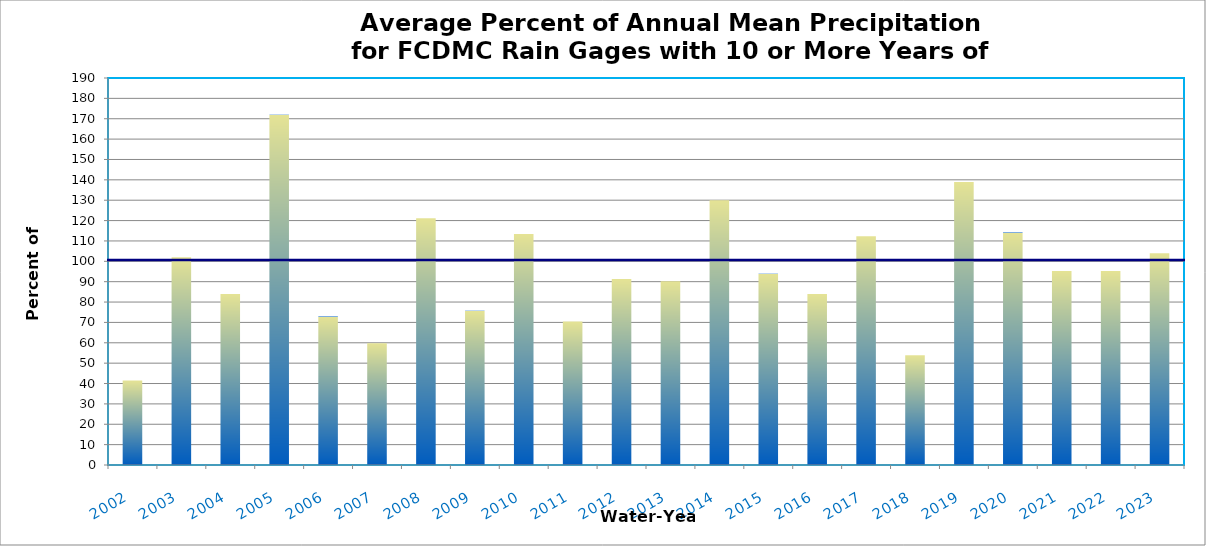
| Category | Series 0 |
|---|---|
| 2002.0 | 41.5 |
| 2003.0 | 102 |
| 2004.0 | 84 |
| 2005.0 | 172 |
| 2006.0 | 72.9 |
| 2007.0 | 59.8 |
| 2008.0 | 121.1 |
| 2009.0 | 75.7 |
| 2010.0 | 113.4 |
| 2011.0 | 70.5 |
| 2012.0 | 91.3 |
| 2013.0 | 90.2 |
| 2014.0 | 130 |
| 2015.0 | 93.9 |
| 2016.0 | 83.9 |
| 2017.0 | 112.3 |
| 2018.0 | 53.9 |
| 2019.0 | 139 |
| 2020.0 | 114.1 |
| 2021.0 | 95.3 |
| 2022.0 | 95.3 |
| 2023.0 | 104 |